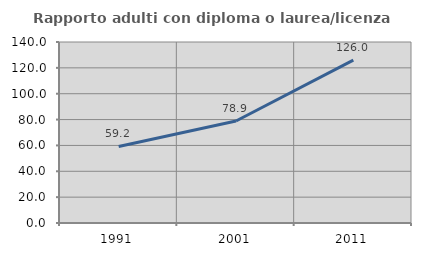
| Category | Rapporto adulti con diploma o laurea/licenza media  |
|---|---|
| 1991.0 | 59.172 |
| 2001.0 | 78.919 |
| 2011.0 | 126.011 |